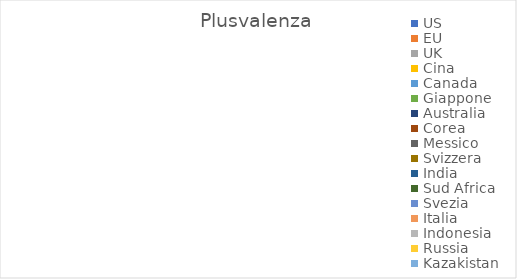
| Category | Plusvalenza |
|---|---|
| US | 0 |
| EU | 0 |
| UK | 0 |
| Cina | 0 |
| Canada | 0 |
| Giappone | 0 |
| Australia | 0 |
| Corea | 0 |
| Messico | 0 |
| Svizzera | 0 |
| India | 0 |
| Sud Africa | 0 |
| Svezia | 0 |
| Italia | 0 |
| Indonesia | 0 |
| Russia | 0 |
| Kazakistan | 0 |